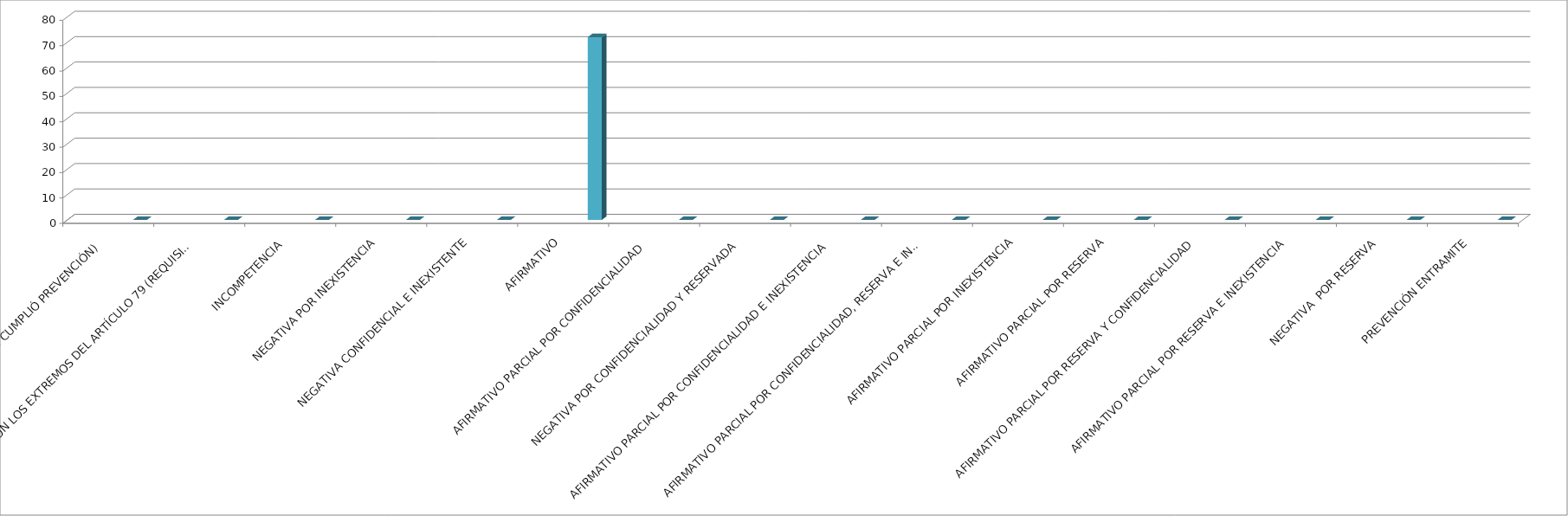
| Category | Series 0 | Series 1 | Series 2 | Series 3 | Series 4 |
|---|---|---|---|---|---|
| SE TIENE POR NO PRESENTADA ( NO CUMPLIÓ PREVENCIÓN) |  |  |  |  | 0 |
| NO CUMPLIO CON LOS EXTREMOS DEL ARTÍCULO 79 (REQUISITOS) |  |  |  |  | 0 |
| INCOMPETENCIA  |  |  |  |  | 0 |
| NEGATIVA POR INEXISTENCIA |  |  |  |  | 0 |
| NEGATIVA CONFIDENCIAL E INEXISTENTE |  |  |  |  | 0 |
| AFIRMATIVO |  |  |  |  | 72 |
| AFIRMATIVO PARCIAL POR CONFIDENCIALIDAD  |  |  |  |  | 0 |
| NEGATIVA POR CONFIDENCIALIDAD Y RESERVADA |  |  |  |  | 0 |
| AFIRMATIVO PARCIAL POR CONFIDENCIALIDAD E INEXISTENCIA |  |  |  |  | 0 |
| AFIRMATIVO PARCIAL POR CONFIDENCIALIDAD, RESERVA E INEXISTENCIA |  |  |  |  | 0 |
| AFIRMATIVO PARCIAL POR INEXISTENCIA |  |  |  |  | 0 |
| AFIRMATIVO PARCIAL POR RESERVA |  |  |  |  | 0 |
| AFIRMATIVO PARCIAL POR RESERVA Y CONFIDENCIALIDAD |  |  |  |  | 0 |
| AFIRMATIVO PARCIAL POR RESERVA E INEXISTENCIA |  |  |  |  | 0 |
| NEGATIVA  POR RESERVA |  |  |  |  | 0 |
| PREVENCIÓN ENTRAMITE |  |  |  |  | 0 |